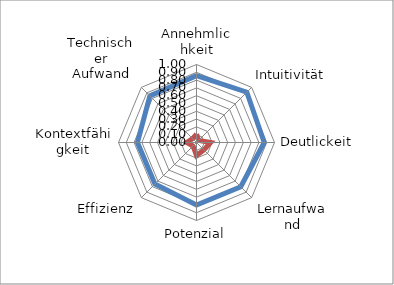
| Category | Series 0 | Series 1 |
|---|---|---|
| Annehmlichkeit | 0.857 | 0.107 |
| Intuitivität | 0.912 | 0.038 |
| Deutlickeit | 0.868 | 0.181 |
| Lernaufwand | 0.802 | 0.134 |
| Potenzial | 0.802 | 0.167 |
| Effizienz | 0.753 | 0.063 |
| Kontextfähigkeit | 0.757 | 0.126 |
| Technischer Aufwand | 0.845 | 0.07 |